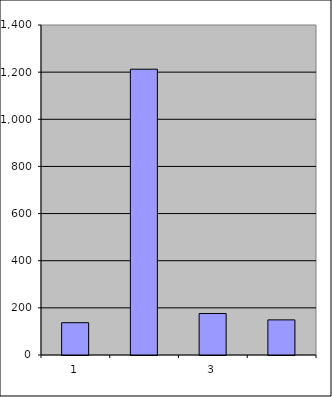
| Category | Series 0 |
|---|---|
| 0 | 137 |
| 1 | 1212.429 |
| 2 | 175.973 |
| 3 | 148.969 |